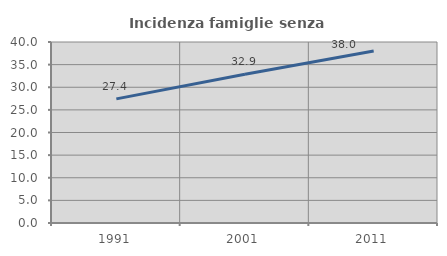
| Category | Incidenza famiglie senza nuclei |
|---|---|
| 1991.0 | 27.426 |
| 2001.0 | 32.87 |
| 2011.0 | 38 |